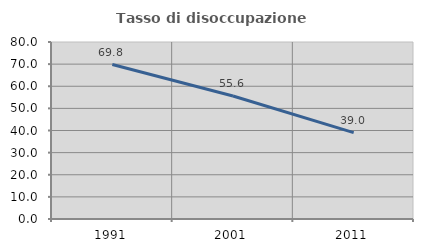
| Category | Tasso di disoccupazione giovanile  |
|---|---|
| 1991.0 | 69.826 |
| 2001.0 | 55.6 |
| 2011.0 | 39.014 |